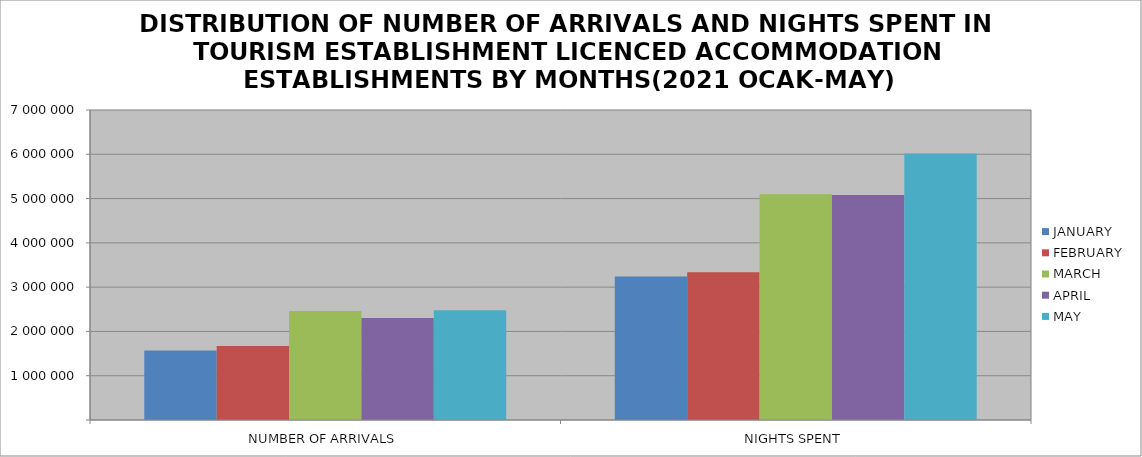
| Category | JANUARY | FEBRUARY | MARCH | APRIL | MAY |
|---|---|---|---|---|---|
| NUMBER OF ARRIVALS | 1571594 | 1670164 | 2462715 | 2305703 | 2480312 |
| NIGHTS SPENT | 3239980 | 3333484 | 5094921 | 5081446 | 6019981 |